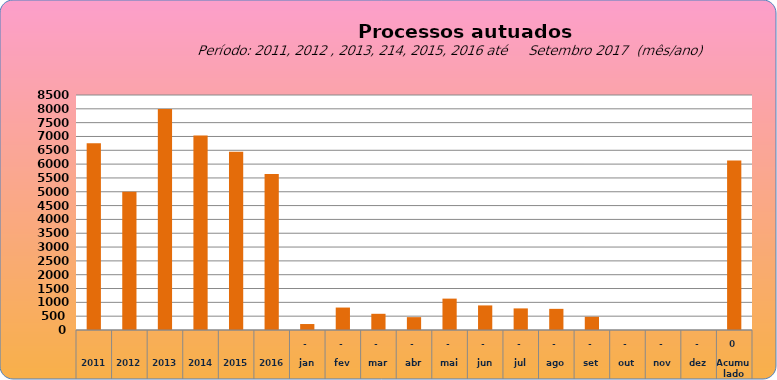
| Category | 6755 |
|---|---|
| 2011 | 6755 |
| 2012 | 4997 |
| 2013 | 7990 |
| 2014 | 7034 |
| 2015 | 6446 |
| 2016 | 5644 |
| jan | 216 |
| fev | 812 |
| mar | 586 |
| abr | 465 |
| mai | 1135 |
| jun | 889 |
| jul | 781 |
| ago | 765 |
| set | 478 |
| out | 0 |
| nov | 0 |
| dez | 0 |
| Acumulado
 | 6127 |